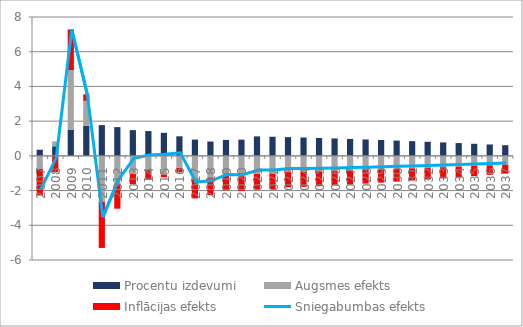
| Category | Procentu izdevumi | Augsmes efekts | Inflācijas efekts |
|---|---|---|---|
| 0 | 0.353 | -0.754 | -1.527 |
| 1 | 0.551 | 0.285 | -0.933 |
| 2 | 1.511 | 3.434 | 2.337 |
| 3 | 1.731 | 1.442 | 0.368 |
| 4 | 1.77 | -2.65 | -2.655 |
| 5 | 1.655 | -1.594 | -1.45 |
| 6 | 1.483 | -1.047 | -0.579 |
| 7 | 1.428 | -0.798 | -0.585 |
| 8 | 1.324 | -1.075 | -0.157 |
| 9 | 1.127 | -0.694 | -0.255 |
| 10 | 0.938 | -1.39 | -1.06 |
| 11 | 0.825 | -1.245 | -1.018 |
| 12 | 0.918 | -1.135 | -0.853 |
| 13 | 0.933 | -1.17 | -0.858 |
| 14 | 1.123 | -1.048 | -0.89 |
| 15 | 1.101 | -1.028 | -0.884 |
| 16 | 1.08 | -0.936 | -0.878 |
| 17 | 1.056 | -0.915 | -0.869 |
| 18 | 1.031 | -0.891 | -0.859 |
| 19 | 1.004 | -0.865 | -0.837 |
| 20 | 0.975 | -0.838 | -0.813 |
| 21 | 0.945 | -0.81 | -0.788 |
| 22 | 0.914 | -0.78 | -0.762 |
| 23 | 0.881 | -0.75 | -0.734 |
| 24 | 0.847 | -0.719 | -0.706 |
| 25 | 0.811 | -0.687 | -0.676 |
| 26 | 0.774 | -0.653 | -0.645 |
| 27 | 0.736 | -0.619 | -0.613 |
| 28 | 0.696 | -0.584 | -0.58 |
| 29 | 0.656 | -0.548 | -0.546 |
| 30 | 0.613 | -0.511 | -0.511 |